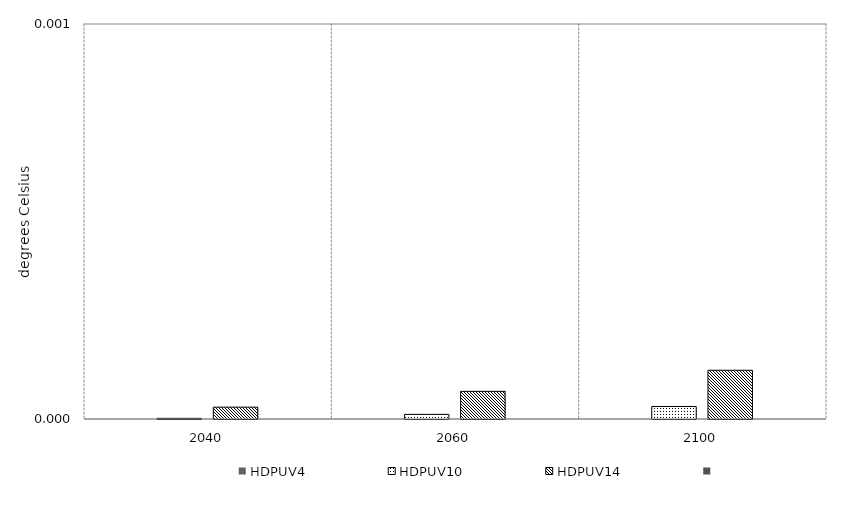
| Category | HDPUV4 | HDPUV10 | HDPUV14 | Series 3 | Alt 5 | Alt 6 | Alt 7 | Alt 8 | Alt 10 |
|---|---|---|---|---|---|---|---|---|---|
| 2040.0 | 0 | 0 | 0 |  |  |  |  |  |  |
| 2060.0 | 0 | 0 | 0 |  |  |  |  |  |  |
| 2100.0 | 0 | 0 | 0 |  |  |  |  |  |  |